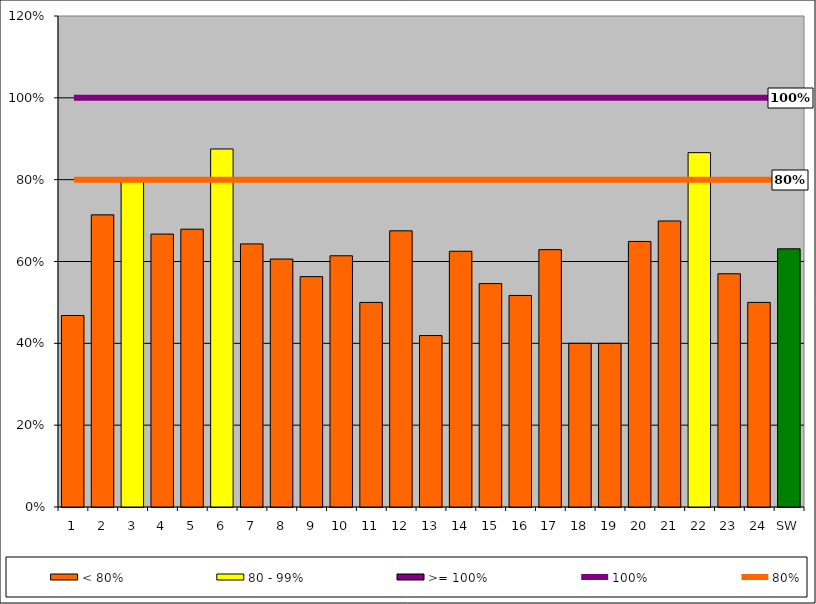
| Category | < 80% | 80 - 99% | >= 100% |
|---|---|---|---|
| 1 | 0.468 | 0 | 0 |
| 2 | 0.714 | 0 | 0 |
| 3 | 0 | 0.8 | 0 |
| 4 | 0.667 | 0 | 0 |
| 5 | 0.679 | 0 | 0 |
| 6 | 0 | 0.875 | 0 |
| 7 | 0.643 | 0 | 0 |
| 8 | 0.606 | 0 | 0 |
| 9 | 0.563 | 0 | 0 |
| 10 | 0.614 | 0 | 0 |
| 11 | 0.5 | 0 | 0 |
| 12 | 0.675 | 0 | 0 |
| 13 | 0.419 | 0 | 0 |
| 14 | 0.625 | 0 | 0 |
| 15 | 0.546 | 0 | 0 |
| 16 | 0.517 | 0 | 0 |
| 17 | 0.629 | 0 | 0 |
| 18 | 0.4 | 0 | 0 |
| 19 | 0.4 | 0 | 0 |
| 20 | 0.649 | 0 | 0 |
| 21 | 0.699 | 0 | 0 |
| 22 | 0 | 0.866 | 0 |
| 23 | 0.57 | 0 | 0 |
| 24 | 0.5 | 0 | 0 |
| SW | 0.631 | 0 | 0 |